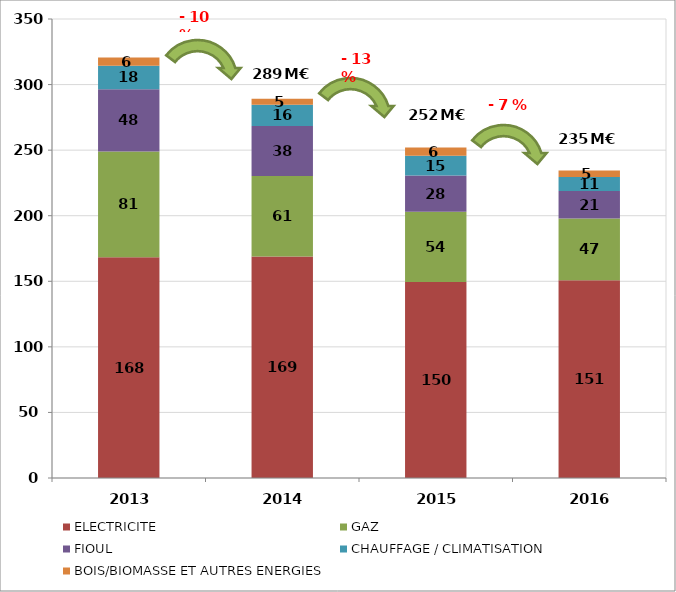
| Category | ELECTRICITE  | GAZ  | FIOUL  | CHAUFFAGE / CLIMATISATION  | BOIS/BIOMASSE ET AUTRES ENERGIES |
|---|---|---|---|---|---|
| 2013.0 | 168.238 | 80.643 | 47.589 | 17.909 | 6.343 |
| 2014.0 | 168.845 | 61.43 | 38.212 | 16.066 | 4.728 |
| 2015.0 | 149.515 | 53.535 | 27.63 | 15.029 | 6.281 |
| 2016.0 | 150.876 | 46.952 | 21.013 | 10.718 | 4.976 |